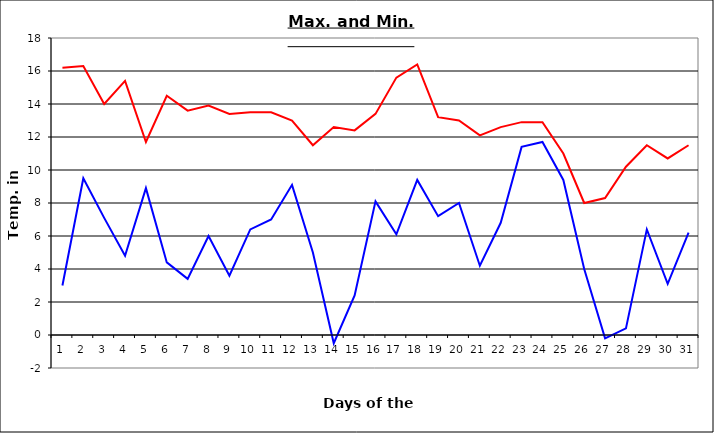
| Category | Series 0 | Series 1 |
|---|---|---|
| 0 | 16.2 | 3 |
| 1 | 16.3 | 9.5 |
| 2 | 14 | 7.1 |
| 3 | 15.4 | 4.8 |
| 4 | 11.7 | 8.9 |
| 5 | 14.5 | 4.4 |
| 6 | 13.6 | 3.4 |
| 7 | 13.9 | 6 |
| 8 | 13.4 | 3.6 |
| 9 | 13.5 | 6.4 |
| 10 | 13.5 | 7 |
| 11 | 13 | 9.1 |
| 12 | 11.5 | 5 |
| 13 | 12.6 | -0.5 |
| 14 | 12.4 | 2.4 |
| 15 | 13.4 | 8.1 |
| 16 | 15.6 | 6.1 |
| 17 | 16.4 | 9.4 |
| 18 | 13.2 | 7.2 |
| 19 | 13 | 8 |
| 20 | 12.1 | 4.2 |
| 21 | 12.6 | 6.8 |
| 22 | 12.9 | 11.4 |
| 23 | 12.9 | 11.7 |
| 24 | 11 | 9.4 |
| 25 | 8 | 4 |
| 26 | 8.3 | -0.2 |
| 27 | 10.2 | 0.4 |
| 28 | 11.5 | 6.4 |
| 29 | 10.7 | 3.1 |
| 30 | 11.5 | 6.2 |